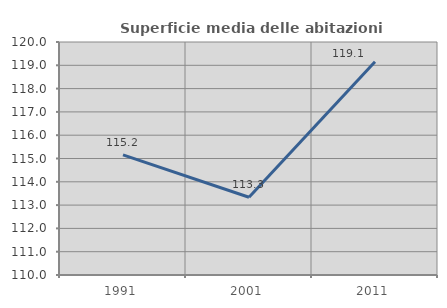
| Category | Superficie media delle abitazioni occupate |
|---|---|
| 1991.0 | 115.159 |
| 2001.0 | 113.335 |
| 2011.0 | 119.15 |